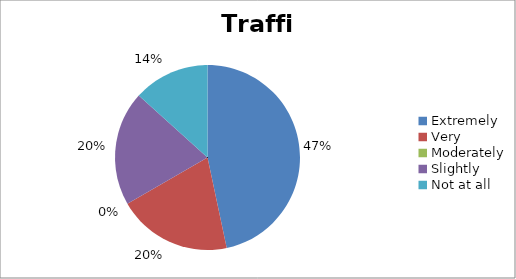
| Category | Traffic |
|---|---|
| Extremely | 7 |
| Very | 3 |
| Moderately | 0 |
| Slightly | 3 |
| Not at all | 2 |